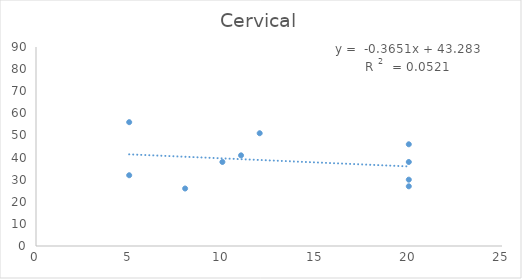
| Category | Cervical |
|---|---|
| 5.0 | 56 |
| 11.0 | 41 |
| 5.0 | 32 |
| 12.0 | 51 |
| 20.0 | 27 |
| 20.0 | 38 |
| 20.0 | 30 |
| 20.0 | 46 |
| 10.0 | 38 |
| 8.0 | 26 |